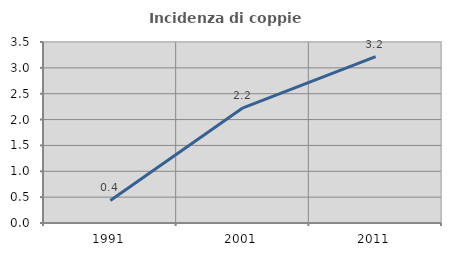
| Category | Incidenza di coppie miste |
|---|---|
| 1991.0 | 0.436 |
| 2001.0 | 2.228 |
| 2011.0 | 3.217 |